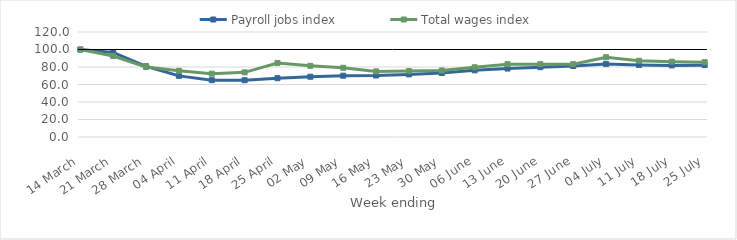
| Category | Payroll jobs index | Total wages index |
|---|---|---|
| 2020-03-14 | 100 | 100 |
| 2020-03-21 | 96.658 | 92.543 |
| 2020-03-28 | 80.814 | 80.015 |
| 2020-04-04 | 69.835 | 75.625 |
| 2020-04-11 | 64.935 | 72.351 |
| 2020-04-18 | 64.87 | 73.872 |
| 2020-04-25 | 67.213 | 84.643 |
| 2020-05-02 | 68.883 | 81.332 |
| 2020-05-09 | 70.027 | 79.129 |
| 2020-05-16 | 70.255 | 74.971 |
| 2020-05-23 | 71.554 | 75.306 |
| 2020-05-30 | 73.134 | 76.039 |
| 2020-06-06 | 76.167 | 79.692 |
| 2020-06-13 | 78.228 | 83.258 |
| 2020-06-20 | 79.815 | 83.259 |
| 2020-06-27 | 81.157 | 83.258 |
| 2020-07-04 | 83.382 | 91.17 |
| 2020-07-11 | 82.364 | 87.099 |
| 2020-07-18 | 81.772 | 86.079 |
| 2020-07-25 | 82.131 | 85.511 |